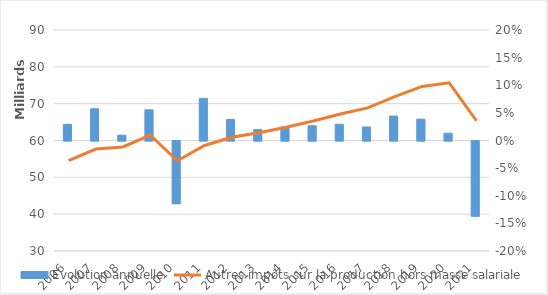
| Category | Evolution annuelle |
|---|---|
| 2006.0 | 0.029 |
| 2007.0 | 0.057 |
| 2008.0 | 0.01 |
| 2009.0 | 0.055 |
| 2010.0 | -0.113 |
| 2011.0 | 0.076 |
| 2012.0 | 0.038 |
| 2013.0 | 0.02 |
| 2014.0 | 0.024 |
| 2015.0 | 0.027 |
| 2016.0 | 0.029 |
| 2017.0 | 0.024 |
| 2018.0 | 0.044 |
| 2019.0 | 0.039 |
| 2020.0 | 0.013 |
| 2021.0 | -0.136 |